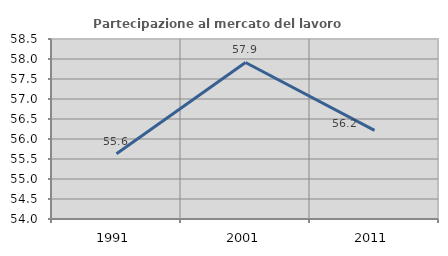
| Category | Partecipazione al mercato del lavoro  femminile |
|---|---|
| 1991.0 | 55.629 |
| 2001.0 | 57.913 |
| 2011.0 | 56.217 |